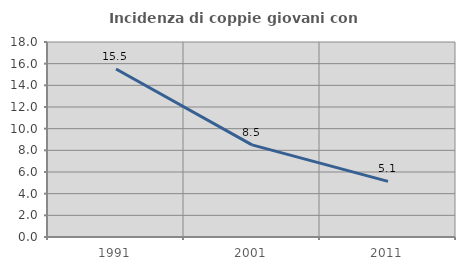
| Category | Incidenza di coppie giovani con figli |
|---|---|
| 1991.0 | 15.51 |
| 2001.0 | 8.503 |
| 2011.0 | 5.137 |